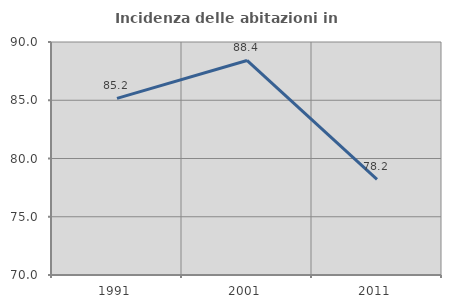
| Category | Incidenza delle abitazioni in proprietà  |
|---|---|
| 1991.0 | 85.165 |
| 2001.0 | 88.415 |
| 2011.0 | 78.205 |